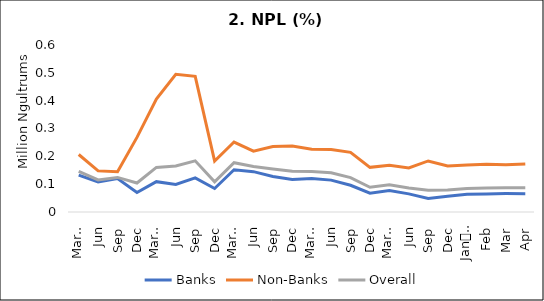
| Category | Banks | Non-Banks | Overall |
|---|---|---|---|
| 0 | 0.133 | 0.207 | 0.146 |
| 1 | 0.108 | 0.148 | 0.115 |
| 2 | 0.12 | 0.144 | 0.124 |
| 3 | 0.07 | 0.268 | 0.104 |
| 4 | 0.109 | 0.406 | 0.16 |
| 5 | 0.099 | 0.495 | 0.165 |
| 6 | 0.123 | 0.487 | 0.184 |
| 7 | 0.084 | 0.183 | 0.109 |
| 8 | 0.152 | 0.251 | 0.177 |
| 9 | 0.145 | 0.218 | 0.164 |
| 10 | 0.128 | 0.235 | 0.154 |
| 11 | 0.117 | 0.237 | 0.146 |
| 12 | 0.121 | 0.226 | 0.146 |
| 13 | 0.115 | 0.224 | 0.141 |
| 14 | 0.096 | 0.214 | 0.124 |
| 15 | 0.067 | 0.16 | 0.089 |
| 16 | 0.077 | 0.168 | 0.098 |
| 17 | 0.065 | 0.158 | 0.086 |
| 18 | 0.048 | 0.183 | 0.078 |
| 19 | 0.057 | 0.165 | 0.079 |
| 20 | 0.063 | 0.169 | 0.085 |
| 21 | 0.065 | 0.171 | 0.086 |
| 22 | 0.066 | 0.169 | 0.087 |
| 23 | 0.066 | 0.173 | 0.087 |